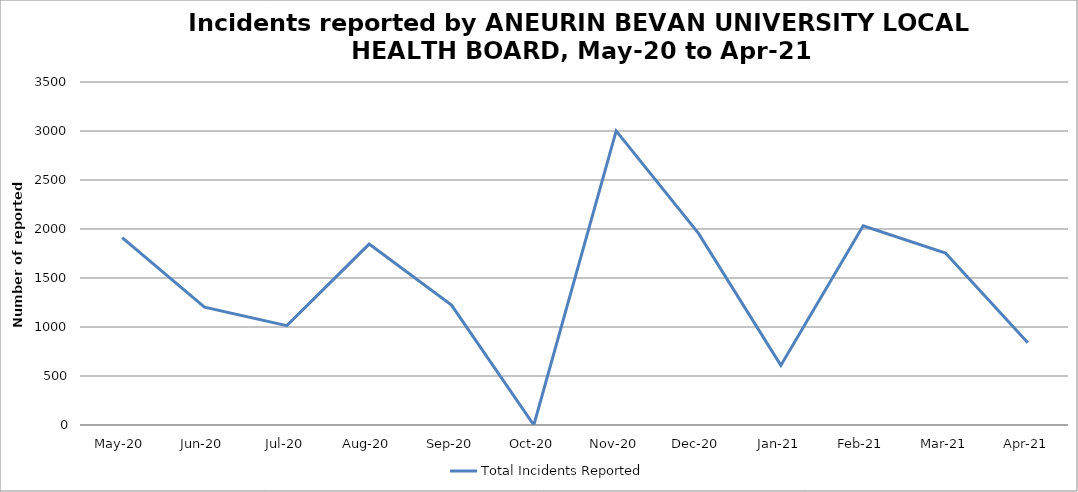
| Category | Total Incidents Reported |
|---|---|
| May-20 | 1913 |
| Jun-20 | 1202 |
| Jul-20 | 1014 |
| Aug-20 | 1846 |
| Sep-20 | 1224 |
| Oct-20 | 0 |
| Nov-20 | 3001 |
| Dec-20 | 1955 |
| Jan-21 | 608 |
| Feb-21 | 2033 |
| Mar-21 | 1755 |
| Apr-21 | 840 |